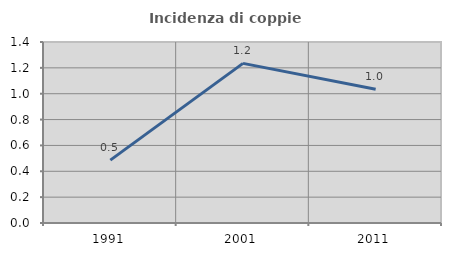
| Category | Incidenza di coppie miste |
|---|---|
| 1991.0 | 0.487 |
| 2001.0 | 1.235 |
| 2011.0 | 1.034 |